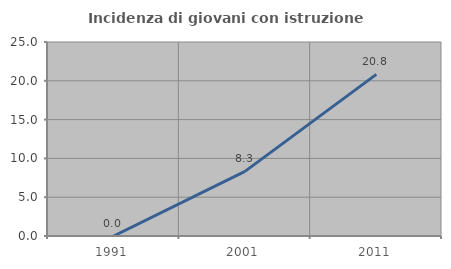
| Category | Incidenza di giovani con istruzione universitaria |
|---|---|
| 1991.0 | 0 |
| 2001.0 | 8.333 |
| 2011.0 | 20.833 |